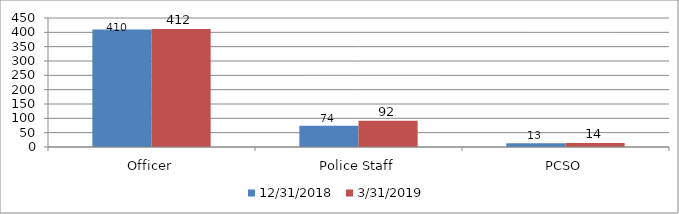
| Category | 31/12/2018 | 31/03/2019 |
|---|---|---|
| Officer | 410 | 412 |
| Police Staff | 74 | 92 |
| PCSO | 13 | 14 |